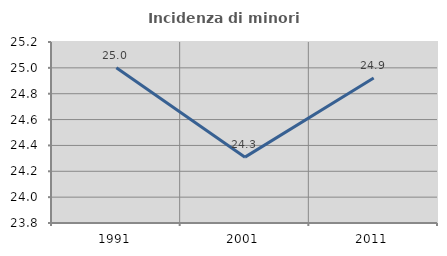
| Category | Incidenza di minori stranieri |
|---|---|
| 1991.0 | 25 |
| 2001.0 | 24.309 |
| 2011.0 | 24.921 |